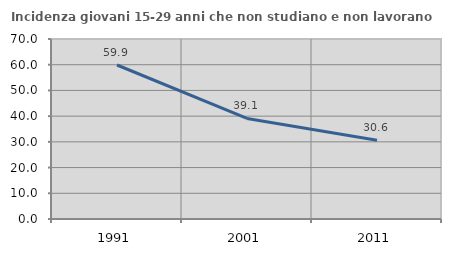
| Category | Incidenza giovani 15-29 anni che non studiano e non lavorano  |
|---|---|
| 1991.0 | 59.886 |
| 2001.0 | 39.121 |
| 2011.0 | 30.625 |